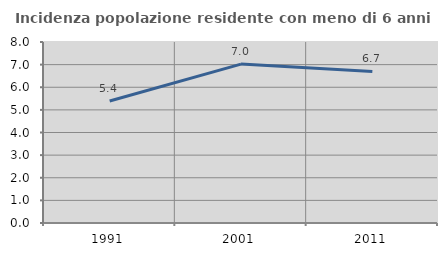
| Category | Incidenza popolazione residente con meno di 6 anni |
|---|---|
| 1991.0 | 5.39 |
| 2001.0 | 7.023 |
| 2011.0 | 6.699 |